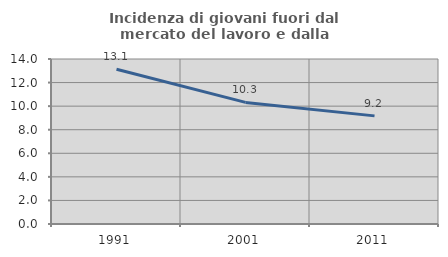
| Category | Incidenza di giovani fuori dal mercato del lavoro e dalla formazione  |
|---|---|
| 1991.0 | 13.131 |
| 2001.0 | 10.319 |
| 2011.0 | 9.174 |